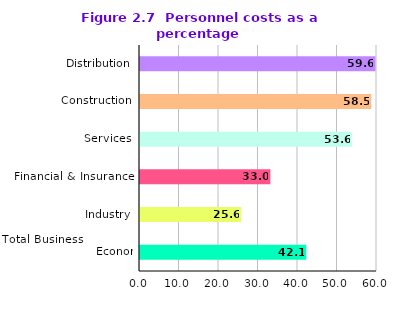
| Category | Personnel costs as % of GVA |
|---|---|
| Total Business                                        Economy | 42.088 |
| Industry | 25.619 |
| Financial & Insurance | 33.004 |
| Services | 53.637 |
| Construction | 58.549 |
| Distribution | 59.603 |